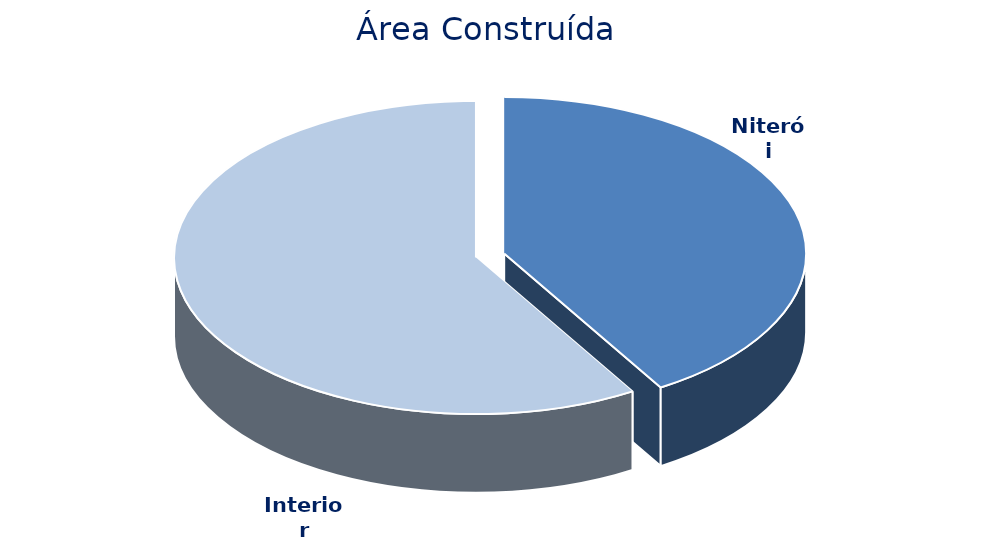
| Category | Área Construída |
|---|---|
| Niterói | 269197 |
| Interior | 382191 |